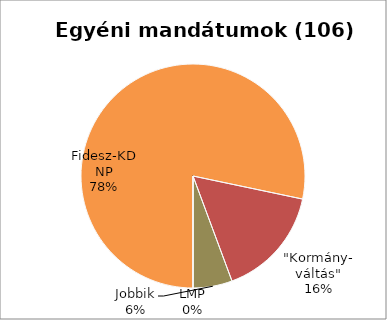
| Category | Egyéni |
|---|---|
| Fidesz-KDNP | 83 |
| "Kormány-
váltás" | 17 |
| Jobbik | 6 |
| LMP | 0 |